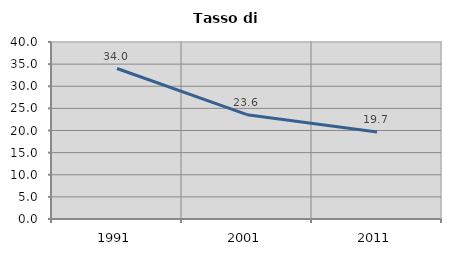
| Category | Tasso di disoccupazione   |
|---|---|
| 1991.0 | 34.009 |
| 2001.0 | 23.574 |
| 2011.0 | 19.674 |